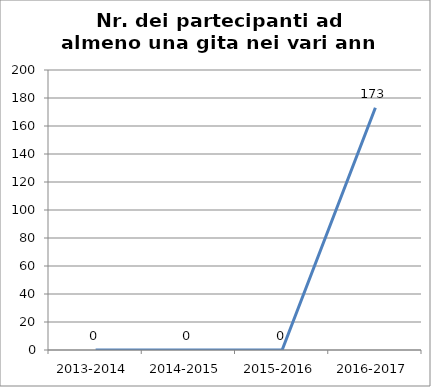
| Category | Nr. Partecipanti ad almeno una Gita |
|---|---|
| 2013-2014 | 0 |
| 2014-2015 | 0 |
| 2015-2016 | 0 |
| 2016-2017 | 173 |